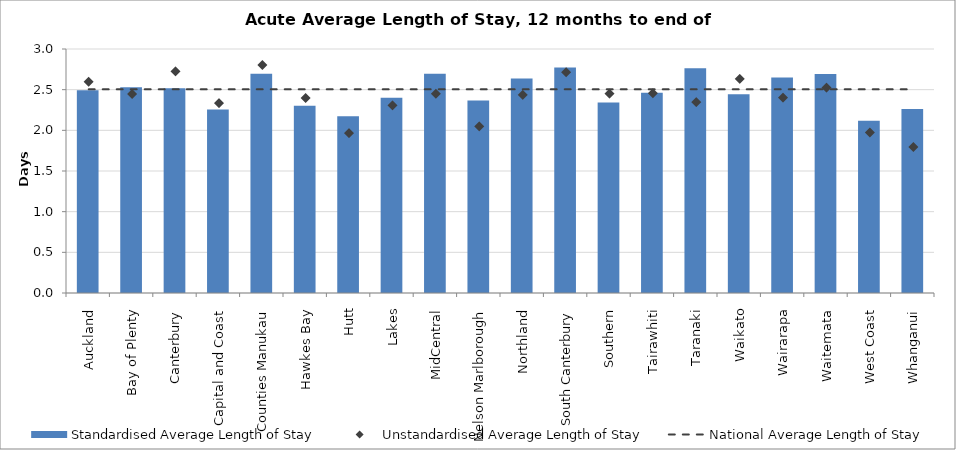
| Category | Standardised Average Length of Stay |
|---|---|
| Auckland | 2.494 |
| Bay of Plenty | 2.53 |
| Canterbury | 2.518 |
| Capital and Coast | 2.255 |
| Counties Manukau | 2.695 |
| Hawkes Bay | 2.302 |
| Hutt | 2.173 |
| Lakes | 2.402 |
| MidCentral | 2.695 |
| Nelson Marlborough | 2.367 |
| Northland | 2.637 |
| South Canterbury | 2.772 |
| Southern | 2.341 |
| Tairawhiti | 2.462 |
| Taranaki | 2.764 |
| Waikato | 2.443 |
| Wairarapa | 2.648 |
| Waitemata | 2.693 |
| West Coast | 2.117 |
| Whanganui | 2.261 |